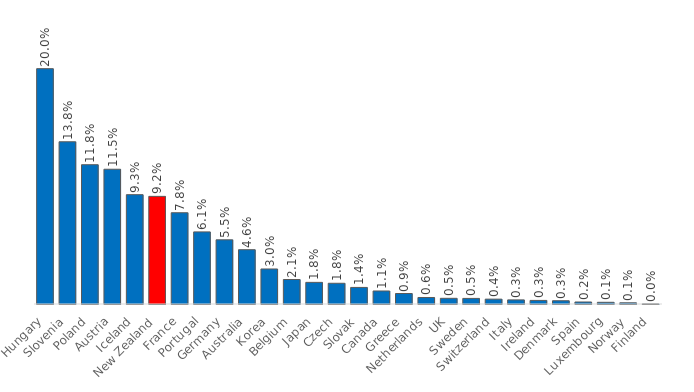
| Category | Scholarship share |
|---|---|
| Hungary | 0.2 |
| Slovenia | 0.138 |
| Poland | 0.118 |
| Austria | 0.115 |
| Iceland | 0.093 |
| New Zealand | 0.092 |
| France | 0.078 |
| Portugal | 0.061 |
| Germany | 0.055 |
| Australia | 0.046 |
| Korea | 0.03 |
| Belgium | 0.021 |
| Japan | 0.018 |
| Czech | 0.018 |
| Slovak | 0.014 |
| Canada | 0.011 |
| Greece | 0.009 |
| Netherlands | 0.006 |
| UK | 0.005 |
| Sweden | 0.005 |
| Switzerland | 0.004 |
| Italy | 0.003 |
| Ireland | 0.003 |
| Denmark | 0.003 |
| Spain | 0.002 |
| Luxembourg | 0.001 |
| Norway | 0.001 |
| Finland | 0 |